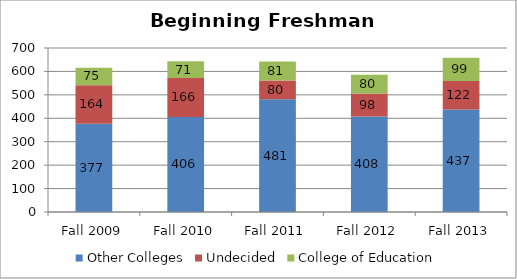
| Category | Other Colleges | Undecided | College of Education |
|---|---|---|---|
| Fall 2009 | 377 | 164 | 75 |
| Fall 2010 | 406 | 166 | 71 |
| Fall 2011 | 481 | 80 | 81 |
| Fall 2012 | 408 | 98 | 80 |
| Fall 2013 | 437 | 122 | 99 |